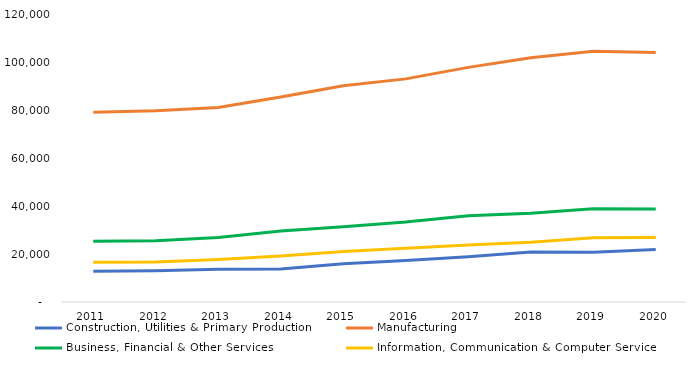
| Category | Construction, Utilities & Primary Production  | Manufacturing  | Business, Financial & Other Services | Information, Communication & Computer Services |
|---|---|---|---|---|
| 2011.0 | 12819 | 79360 | 25359 | 16609 |
| 2012.0 | 13111 | 79986 | 25581 | 16727 |
| 2013.0 | 13646 | 81351 | 26990 | 17816 |
| 2014.0 | 13837 | 85740 | 29721 | 19267 |
| 2015.0 | 15954 | 90458 | 31473 | 21132 |
| 2016.0 | 17383 | 93294 | 33407 | 22517 |
| 2017.0 | 18875 | 98109 | 36105 | 23849 |
| 2018.0 | 20909 | 102079 | 37141 | 25017 |
| 2019.0 | 20837 | 104791 | 39035 | 26891 |
| 2020.0 | 21925 | 104318 | 38926 | 27018 |